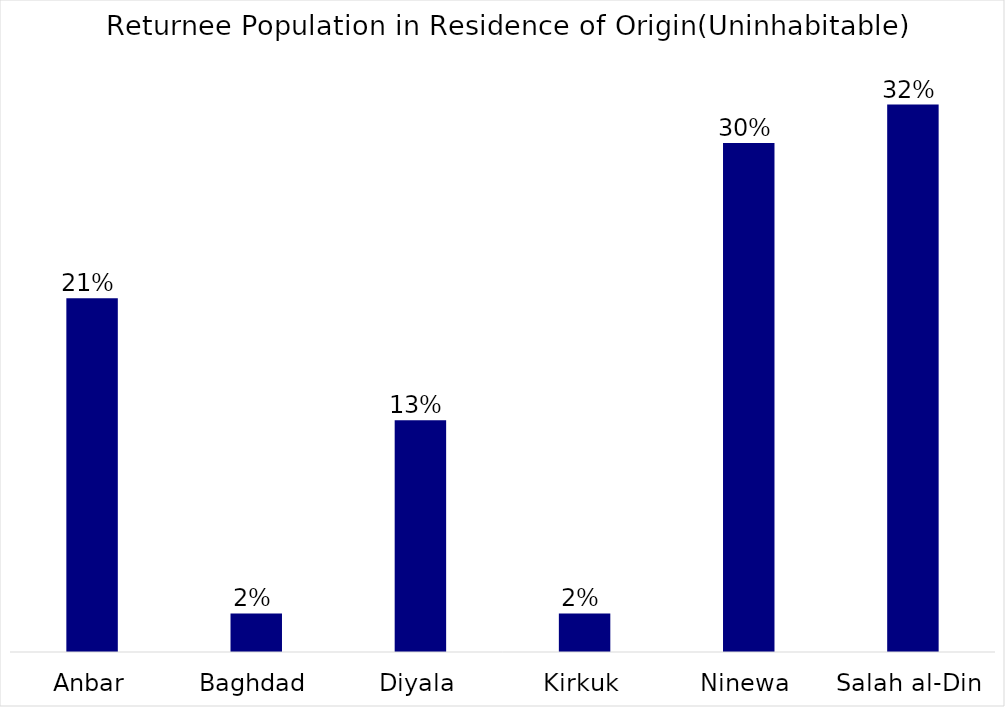
| Category | Series 0 |
|---|---|
| Anbar | 0.206 |
| Baghdad | 0.022 |
| Diyala | 0.135 |
| Kirkuk | 0.022 |
| Ninewa | 0.296 |
| Salah al-Din | 0.318 |